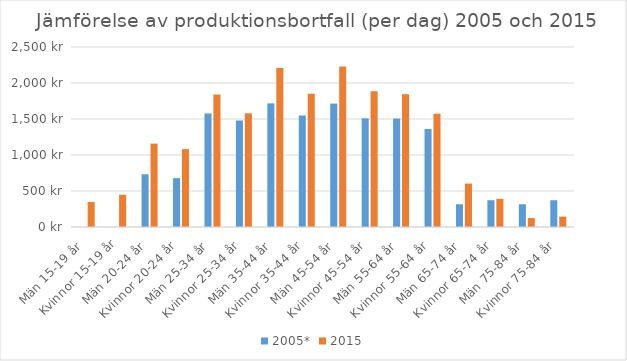
| Category | 2005* | 2015 |
|---|---|---|
| Män 15-19 år  | 0 | 347.467 |
| Kvinnor 15-19 år | 0 | 447.951 |
| Män 20-24 år  | 732 | 1157.981 |
| Kvinnor 20-24 år  | 679 | 1081.911 |
| Män 25-34 år  | 1577 | 1842.002 |
| Kvinnor 25-34 år  | 1479 | 1578.833 |
| Män 35-44 år  | 1717 | 2209.035 |
| Kvinnor 35-44 år  | 1549 | 1850.195 |
| Män 45-54 år  | 1714 | 2230.096 |
| Kvinnor 45-54 år  | 1510 | 1885.009 |
| Män 55-64 år  | 1506 | 1844.152 |
| Kvinnor 55-64 år  | 1361 | 1573.601 |
| Män 65-74 år  | 316 | 603.369 |
| Kvinnor 65-74 år  | 372 | 391.958 |
| Män 75-84 år  | 316 | 124.261 |
| Kvinnor 75-84 år  | 372 | 143.679 |